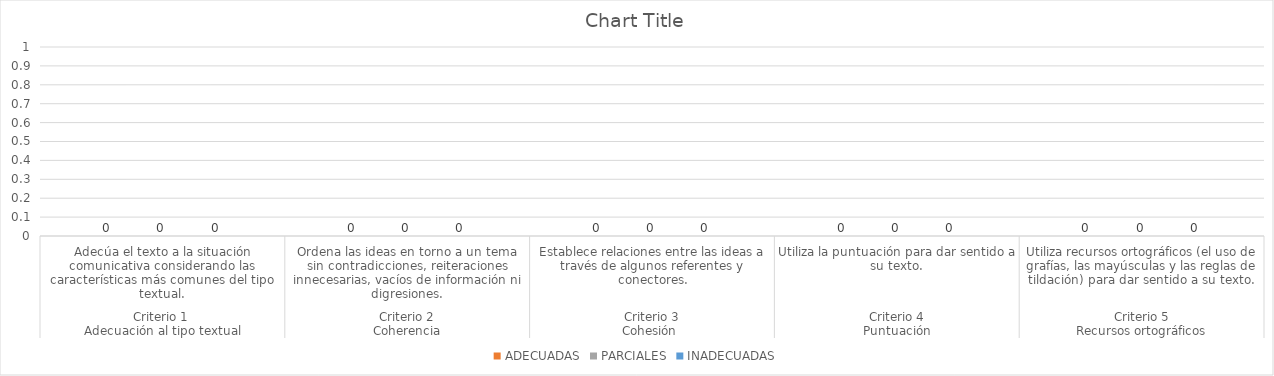
| Category | ADECUADAS | PARCIALES | INADECUADAS |
|---|---|---|---|
| 0 | 0 | 0 | 0 |
| 1 | 0 | 0 | 0 |
| 2 | 0 | 0 | 0 |
| 3 | 0 | 0 | 0 |
| 4 | 0 | 0 | 0 |